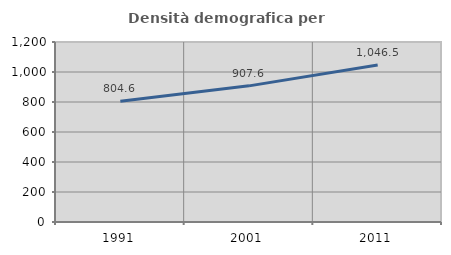
| Category | Densità demografica |
|---|---|
| 1991.0 | 804.577 |
| 2001.0 | 907.584 |
| 2011.0 | 1046.482 |